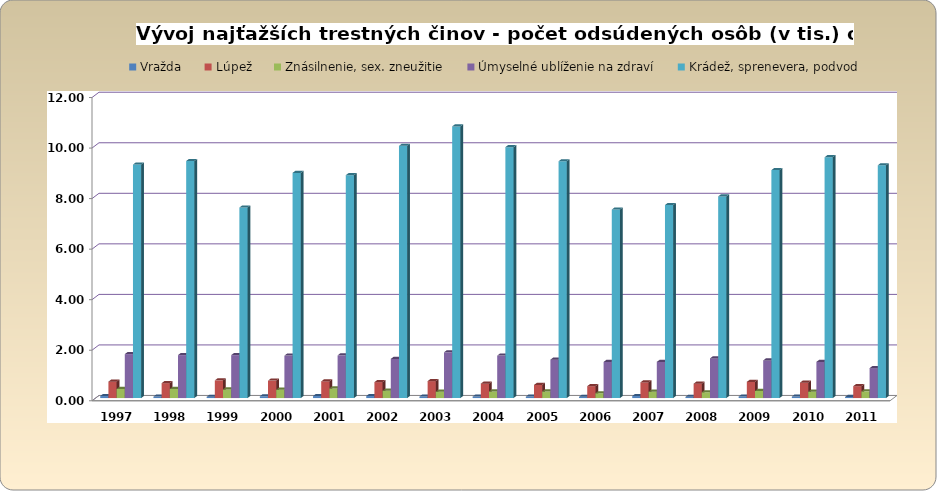
| Category | Vražda | Lúpež | Znásilnenie, sex. zneužitie | Úmyselné ublíženie na zdraví | Krádež, sprenevera, podvod |
|---|---|---|---|---|---|
| 1997.0 | 0.08 | 0.65 | 0.36 | 1.74 | 9.24 |
| 1998.0 | 0.06 | 0.59 | 0.36 | 1.7 | 9.38 |
| 1999.0 | 0.05 | 0.7 | 0.34 | 1.7 | 7.54 |
| 2000.0 | 0.07 | 0.69 | 0.33 | 1.68 | 8.91 |
| 2001.0 | 0.08 | 0.66 | 0.38 | 1.69 | 8.82 |
| 2002.0 | 0.08 | 0.63 | 0.29 | 1.55 | 9.98 |
| 2003.0 | 0.06 | 0.67 | 0.25 | 1.81 | 10.75 |
| 2004.0 | 0.06 | 0.57 | 0.26 | 1.68 | 9.93 |
| 2005.0 | 0.06 | 0.52 | 0.26 | 1.52 | 9.37 |
| 2006.0 | 0.05 | 0.47 | 0.19 | 1.43 | 7.46 |
| 2007.0 | 0.08 | 0.62 | 0.25 | 1.43 | 7.64 |
| 2008.0 | 0.05 | 0.57 | 0.23 | 1.57 | 7.98 |
| 2009.0 | 0.06 | 0.64 | 0.28 | 1.49 | 9.02 |
| 2010.0 | 0.06 | 0.61 | 0.25 | 1.43 | 9.53 |
| 2011.0 | 0.043 | 0.47 | 0.265 | 1.184 | 9.212 |